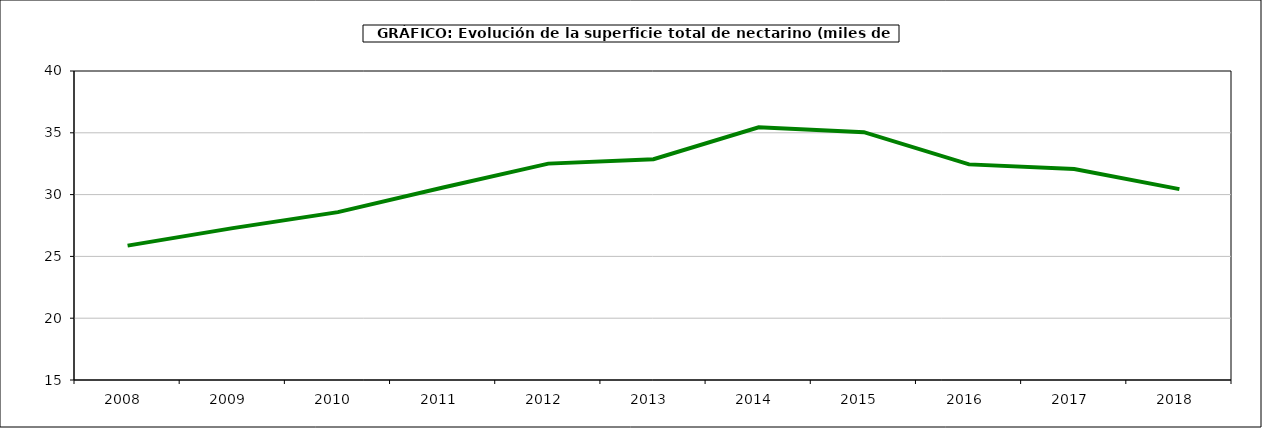
| Category | superficie melocotonero |
|---|---|
| 2008.0 | 25.872 |
| 2009.0 | 27.289 |
| 2010.0 | 28.581 |
| 2011.0 | 30.569 |
| 2012.0 | 32.506 |
| 2013.0 | 32.867 |
| 2014.0 | 35.45 |
| 2015.0 | 35.048 |
| 2016.0 | 32.445 |
| 2017.0 | 32.078 |
| 2018.0 | 30.442 |